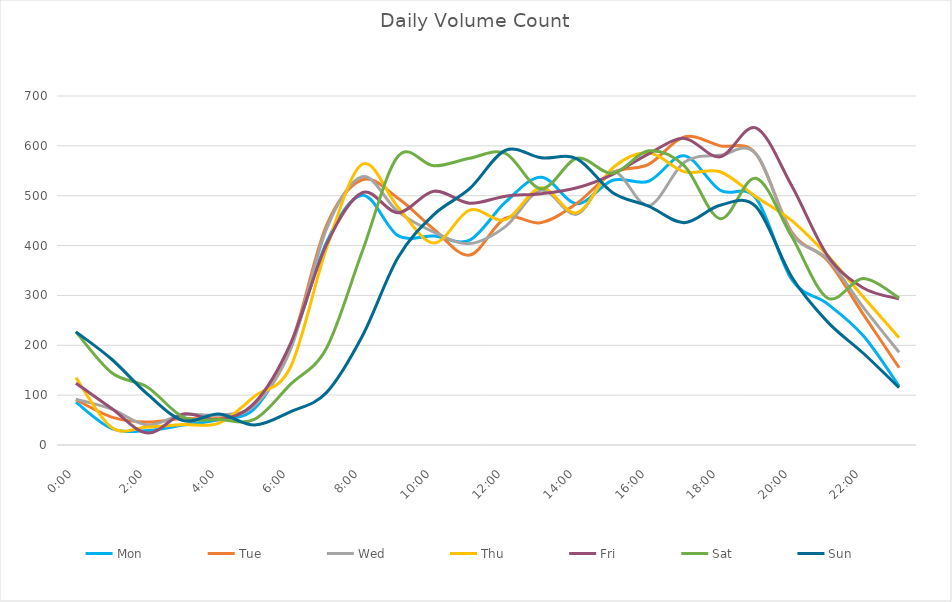
| Category | Mon | Tue | Wed | Thu | Fri | Sat | Sun |
|---|---|---|---|---|---|---|---|
| 0.0 | 86 | 91 | 92 | 135 | 124 | 227 | 227 |
| 0.0416666666666667 | 33 | 56 | 72 | 35 | 73 | 145 | 172 |
| 0.0833333333333333 | 29 | 46 | 40 | 36 | 24 | 116 | 102 |
| 0.125 | 40 | 53 | 61 | 41 | 62 | 56 | 49 |
| 0.166666666666667 | 51 | 54 | 60 | 44 | 51 | 51 | 62 |
| 0.208333333333333 | 74 | 82 | 80 | 98 | 85 | 52 | 40 |
| 0.25 | 198 | 200 | 192 | 157 | 204 | 122 | 67 |
| 0.291666666666667 | 406 | 440 | 433 | 394 | 402 | 194 | 105 |
| 0.333333333333333 | 501 | 532 | 538 | 563 | 506 | 388 | 218 |
| 0.375 | 420 | 495 | 468 | 477 | 466 | 579 | 376 |
| 0.416666666666667 | 419 | 433 | 427 | 405 | 509 | 560 | 462 |
| 0.4583333333333333 | 411 | 381 | 404 | 471 | 485 | 575 | 514 |
| 0.5 | 487 | 455 | 438 | 452 | 499 | 585 | 591 |
| 0.541666666666667 | 537 | 446 | 511 | 516 | 504 | 514 | 576 |
| 0.5833333333333334 | 484 | 485 | 463 | 466 | 516 | 575 | 574 |
| 0.625 | 531 | 546 | 548 | 556 | 543 | 545 | 506 |
| 0.666666666666667 | 529 | 563 | 480 | 586 | 584 | 590 | 479 |
| 0.7083333333333334 | 580 | 618 | 567 | 548 | 615 | 560 | 446 |
| 0.75 | 511 | 600 | 581 | 548 | 578 | 454 | 481 |
| 0.791666666666667 | 495 | 584 | 584 | 498 | 636 | 535 | 478 |
| 0.8333333333333334 | 332 | 427 | 424 | 450 | 520 | 418 | 337 |
| 0.875 | 283 | 370 | 373 | 380 | 380 | 295 | 247 |
| 0.916666666666667 | 219 | 262 | 276 | 297 | 315 | 334 | 184 |
| 0.9583333333333334 | 118 | 155 | 186 | 215 | 293 | 295 | 115 |